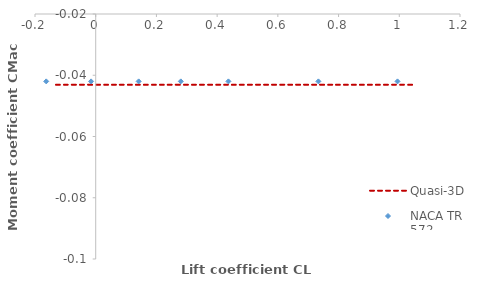
| Category | Quasi-3D |
|---|---|
| -0.13092 | -0.043 |
| 0.01151 | -0.043 |
| 0.15398 | -0.043 |
| 0.43748 | -0.043 |
| 0.71646 | -0.043 |
| 0.85332 | -0.043 |
| 1.0543 | -0.043 |